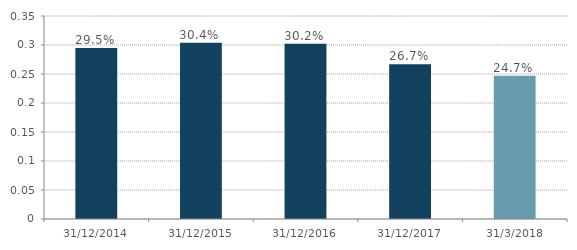
| Category | Series 0 |
|---|---|
| 2014-12-31 | 0.295 |
| 2015-12-31 | 0.304 |
| 2016-12-31 | 0.302 |
| 2017-12-31 | 0.267 |
| 2018-03-31 | 0.247 |